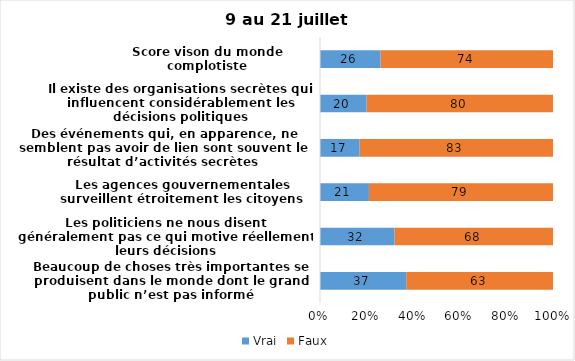
| Category | Vrai | Faux |
|---|---|---|
| Beaucoup de choses très importantes se produisent dans le monde dont le grand public n’est pas informé | 37 | 63 |
| Les politiciens ne nous disent généralement pas ce qui motive réellement leurs décisions | 32 | 68 |
| Les agences gouvernementales surveillent étroitement les citoyens | 21 | 79 |
| Des événements qui, en apparence, ne semblent pas avoir de lien sont souvent le résultat d’activités secrètes | 17 | 83 |
| Il existe des organisations secrètes qui influencent considérablement les décisions politiques | 20 | 80 |
| Score vison du monde complotiste | 26 | 74 |